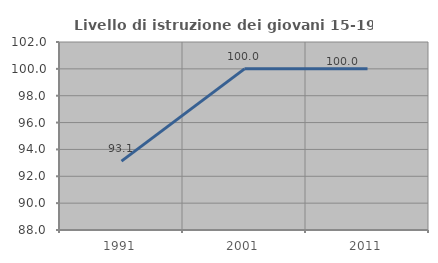
| Category | Livello di istruzione dei giovani 15-19 anni |
|---|---|
| 1991.0 | 93.13 |
| 2001.0 | 100 |
| 2011.0 | 100 |